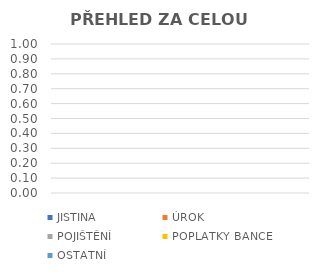
| Category | JISTINA | ÚROK | POJIŠTĚNÍ | POPLATKY BANCE | OSTATNÍ |
|---|---|---|---|---|---|
| 0 | 0 | 0 | 0 | 0 | 0 |